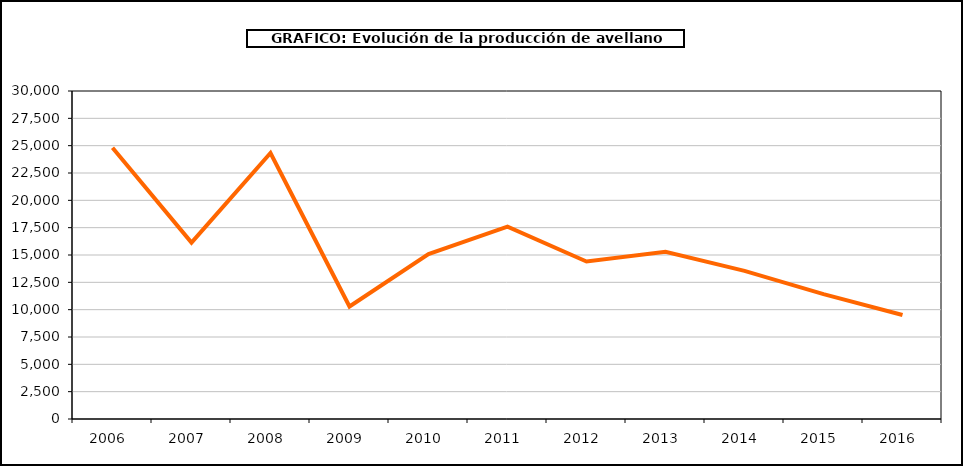
| Category | producción avellano |
|---|---|
| 2006.0 | 24810 |
| 2007.0 | 16134 |
| 2008.0 | 24330 |
| 2009.0 | 10290 |
| 2010.0 | 15086 |
| 2011.0 | 17590 |
| 2012.0 | 14406 |
| 2013.0 | 15302 |
| 2014.0 | 13544 |
| 2015.0 | 11423 |
| 2016.0 | 9510 |